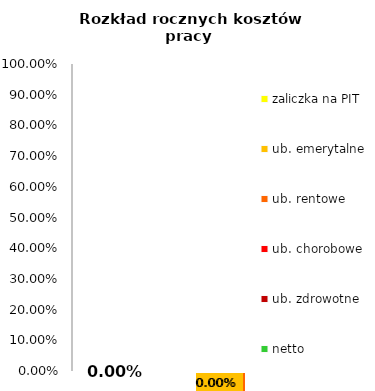
| Category | netto | ub. zdrowotne | ub. chorobowe | ub. rentowe | ub. emerytalne | zaliczka na PIT |
|---|---|---|---|---|---|---|
| 0 | 0 | 0 | 0 | 0 | 0 | 0 |